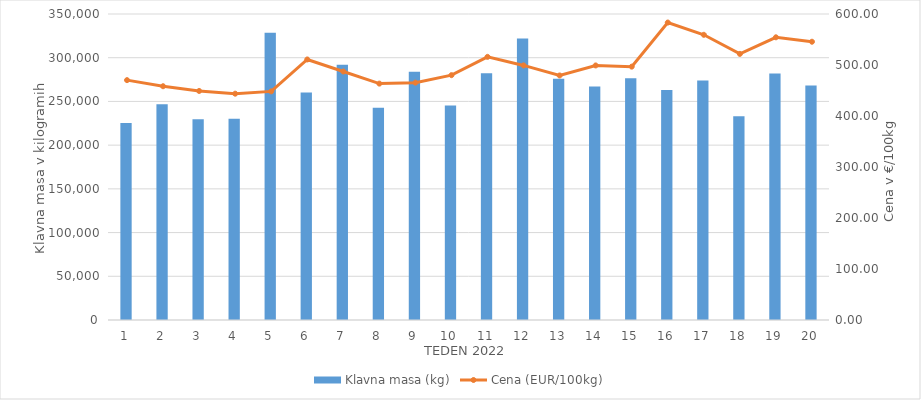
| Category | Klavna masa (kg) |
|---|---|
| 1.0 | 225300 |
| 2.0 | 246712 |
| 3.0 | 229541 |
| 4.0 | 230074 |
| 5.0 | 328640 |
| 6.0 | 260108 |
| 7.0 | 291887 |
| 8.0 | 242732 |
| 9.0 | 283987 |
| 10.0 | 245414 |
| 11.0 | 282092 |
| 12.0 | 321936 |
| 13.0 | 275950 |
| 14.0 | 267148 |
| 15.0 | 276417 |
| 16.0 | 263098 |
| 17.0 | 273824 |
| 18.0 | 232926 |
| 19.0 | 281859 |
| 20.0 | 268153 |